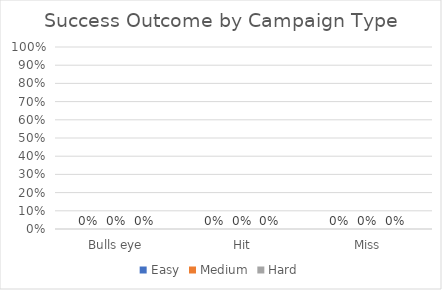
| Category | Easy | Medium | Hard |
|---|---|---|---|
| Bulls eye | 0 | 0 | 0 |
| Hit | 0 | 0 | 0 |
| Miss | 0 | 0 | 0 |